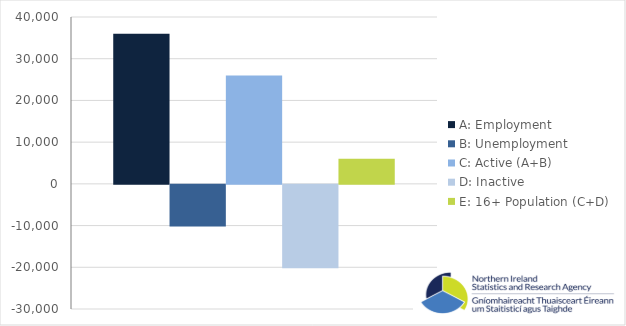
| Category | A: Employment | B: Unemployment | C: Active (A+B) | D: Inactive | E: 16+ Population (C+D) |
|---|---|---|---|---|---|
| 0 | 36000 | -10000 | 26000 | -20000 | 6000 |